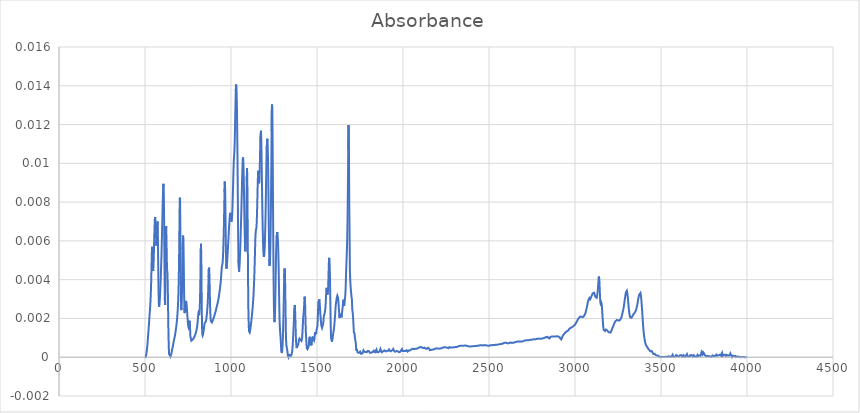
| Category | Absorbance |
|---|---|
| 3997.70514 | 0 |
| 3995.77668 | 0 |
| 3993.84822 | 0 |
| 3991.91975 | 0 |
| 3989.99129 | 0 |
| 3988.06283 | 0 |
| 3986.13436 | 0 |
| 3984.2059 | 0 |
| 3982.27743 | 0 |
| 3980.34897 | 0 |
| 3978.42051 | 0 |
| 3976.49204 | 0 |
| 3974.56358 | 0 |
| 3972.63512 | 0 |
| 3970.70665 | 0 |
| 3968.77819 | 0 |
| 3966.84973 | 0 |
| 3964.92126 | 0 |
| 3962.9928 | 0 |
| 3961.06433 | 0 |
| 3959.13587 | 0 |
| 3957.20741 | 0 |
| 3955.27894 | 0 |
| 3953.35048 | 0 |
| 3951.42202 | 0 |
| 3949.49355 | 0 |
| 3947.56509 | 0 |
| 3945.63663 | 0 |
| 3943.70816 | 0 |
| 3941.7797 | 0 |
| 3939.85123 | 0 |
| 3937.92277 | 0 |
| 3935.99431 | 0 |
| 3934.06584 | 0 |
| 3932.13738 | 0 |
| 3930.20892 | 0 |
| 3928.28045 | 0 |
| 3926.35199 | 0 |
| 3924.42353 | 0 |
| 3922.49506 | 0 |
| 3920.5666 | 0 |
| 3918.63813 | 0 |
| 3916.70967 | 0 |
| 3914.78121 | 0 |
| 3912.85274 | 0 |
| 3910.92428 | 0 |
| 3908.99582 | 0 |
| 3907.06735 | 0 |
| 3905.13889 | 0 |
| 3903.21043 | 0 |
| 3901.28196 | 0 |
| 3899.3535 | 0 |
| 3897.42503 | 0 |
| 3895.49657 | 0 |
| 3893.56811 | 0 |
| 3891.63964 | 0 |
| 3889.71118 | 0 |
| 3887.78272 | 0 |
| 3885.85425 | 0 |
| 3883.92579 | 0 |
| 3881.99733 | 0 |
| 3880.06886 | 0 |
| 3878.1404 | 0 |
| 3876.21193 | 0 |
| 3874.28347 | 0 |
| 3872.35501 | 0 |
| 3870.42654 | 0 |
| 3868.49808 | 0 |
| 3866.56962 | 0 |
| 3864.64115 | 0 |
| 3862.71269 | 0 |
| 3860.78422 | 0 |
| 3858.85576 | 0 |
| 3856.9273 | 0 |
| 3854.99883 | 0 |
| 3853.07037 | 0 |
| 3851.14191 | 0 |
| 3849.21344 | 0 |
| 3847.28498 | 0 |
| 3845.35652 | 0 |
| 3843.42805 | 0 |
| 3841.49959 | 0 |
| 3839.57112 | 0 |
| 3837.64266 | 0 |
| 3835.7142 | 0 |
| 3833.78573 | 0 |
| 3831.85727 | 0 |
| 3829.92881 | 0 |
| 3828.00034 | 0 |
| 3826.07188 | 0 |
| 3824.14342 | 0 |
| 3822.21495 | 0 |
| 3820.28649 | 0 |
| 3818.35802 | 0 |
| 3816.42956 | 0 |
| 3814.5011 | 0 |
| 3812.57263 | 0 |
| 3810.64417 | 0 |
| 3808.71571 | 0 |
| 3806.78724 | 0 |
| 3804.85878 | 0 |
| 3802.93032 | 0 |
| 3801.00185 | 0 |
| 3799.07339 | 0 |
| 3797.14492 | 0 |
| 3795.21646 | 0 |
| 3793.288 | 0 |
| 3791.35953 | 0 |
| 3789.43107 | 0 |
| 3787.50261 | 0 |
| 3785.57414 | 0 |
| 3783.64568 | 0 |
| 3781.71722 | 0 |
| 3779.78875 | 0 |
| 3777.86029 | 0 |
| 3775.93182 | 0 |
| 3774.00336 | 0 |
| 3772.0749 | 0 |
| 3770.14643 | 0 |
| 3768.21797 | 0 |
| 3766.28951 | 0 |
| 3764.36104 | 0 |
| 3762.43258 | 0 |
| 3760.50412 | 0 |
| 3758.57565 | 0 |
| 3756.64719 | 0 |
| 3754.71872 | 0 |
| 3752.79026 | 0 |
| 3750.8618 | 0 |
| 3748.93333 | 0 |
| 3747.00487 | 0 |
| 3745.07641 | 0 |
| 3743.14794 | 0 |
| 3741.21948 | 0 |
| 3739.29102 | 0 |
| 3737.36255 | 0 |
| 3735.43409 | 0 |
| 3733.50562 | 0 |
| 3731.57716 | 0 |
| 3729.6487 | 0 |
| 3727.72023 | 0 |
| 3725.79177 | 0 |
| 3723.86331 | 0 |
| 3721.93484 | 0 |
| 3720.00638 | 0 |
| 3718.07791 | 0 |
| 3716.14945 | 0 |
| 3714.22099 | 0 |
| 3712.29252 | 0 |
| 3710.36406 | 0 |
| 3708.4356 | 0 |
| 3706.50713 | 0 |
| 3704.57867 | 0 |
| 3702.65021 | 0 |
| 3700.72174 | 0 |
| 3698.79328 | 0 |
| 3696.86481 | 0 |
| 3694.93635 | 0 |
| 3693.00789 | 0 |
| 3691.07942 | 0 |
| 3689.15096 | 0 |
| 3687.2225 | 0 |
| 3685.29403 | 0 |
| 3683.36557 | 0 |
| 3681.43711 | 0 |
| 3679.50864 | 0 |
| 3677.58018 | 0 |
| 3675.65171 | 0 |
| 3673.72325 | 0 |
| 3671.79479 | 0 |
| 3669.86632 | 0 |
| 3667.93786 | 0 |
| 3666.0094 | 0 |
| 3664.08093 | 0 |
| 3662.15247 | 0 |
| 3660.22401 | 0 |
| 3658.29554 | 0 |
| 3656.36708 | 0 |
| 3654.43861 | 0 |
| 3652.51015 | 0 |
| 3650.58169 | 0 |
| 3648.65322 | 0 |
| 3646.72476 | 0 |
| 3644.7963 | 0 |
| 3642.86783 | 0 |
| 3640.93937 | 0 |
| 3639.01091 | 0 |
| 3637.08244 | 0 |
| 3635.15398 | 0 |
| 3633.22551 | 0 |
| 3631.29705 | 0 |
| 3629.36859 | 0 |
| 3627.44012 | 0 |
| 3625.51166 | 0 |
| 3623.5832 | 0 |
| 3621.65473 | 0 |
| 3619.72627 | 0 |
| 3617.79781 | 0 |
| 3615.86934 | 0 |
| 3613.94088 | 0 |
| 3612.01241 | 0 |
| 3610.08395 | 0 |
| 3608.15549 | 0 |
| 3606.22702 | 0 |
| 3604.29856 | 0 |
| 3602.3701 | 0 |
| 3600.44163 | 0 |
| 3598.51317 | 0 |
| 3596.58471 | 0 |
| 3594.65624 | 0 |
| 3592.72778 | 0 |
| 3590.79931 | 0 |
| 3588.87085 | 0 |
| 3586.94239 | 0 |
| 3585.01392 | 0 |
| 3583.08546 | 0 |
| 3581.157 | 0 |
| 3579.22853 | 0 |
| 3577.30007 | 0 |
| 3575.3716 | 0 |
| 3573.44314 | 0 |
| 3571.51468 | 0 |
| 3569.58621 | 0 |
| 3567.65775 | 0 |
| 3565.72929 | 0 |
| 3563.80082 | 0 |
| 3561.87236 | 0 |
| 3559.9439 | 0 |
| 3558.01543 | 0 |
| 3556.08697 | 0 |
| 3554.1585 | 0 |
| 3552.23004 | 0 |
| 3550.30158 | 0 |
| 3548.37311 | 0 |
| 3546.44465 | 0 |
| 3544.51619 | 0 |
| 3542.58772 | 0 |
| 3540.65926 | 0 |
| 3538.7308 | 0 |
| 3536.80233 | 0 |
| 3534.87387 | 0 |
| 3532.9454 | 0 |
| 3531.01694 | 0 |
| 3529.08848 | 0 |
| 3527.16001 | 0 |
| 3525.23155 | 0 |
| 3523.30309 | 0 |
| 3521.37462 | 0 |
| 3519.44616 | 0 |
| 3517.5177 | 0 |
| 3515.58923 | 0 |
| 3513.66077 | 0 |
| 3511.7323 | 0 |
| 3509.80384 | 0 |
| 3507.87538 | 0 |
| 3505.94691 | 0 |
| 3504.01845 | 0 |
| 3502.08999 | 0 |
| 3500.16152 | 0 |
| 3498.23306 | 0 |
| 3496.3046 | 0 |
| 3494.37613 | 0 |
| 3492.44767 | 0 |
| 3490.5192 | 0 |
| 3488.59074 | 0 |
| 3486.66228 | 0 |
| 3484.73381 | 0 |
| 3482.80535 | 0 |
| 3480.87689 | 0 |
| 3478.94842 | 0 |
| 3477.01996 | 0 |
| 3475.0915 | 0 |
| 3473.16303 | 0 |
| 3471.23457 | 0 |
| 3469.3061 | 0 |
| 3467.37764 | 0 |
| 3465.44918 | 0 |
| 3463.52071 | 0 |
| 3461.59225 | 0 |
| 3459.66379 | 0 |
| 3457.73532 | 0 |
| 3455.80686 | 0 |
| 3453.8784 | 0 |
| 3451.94993 | 0 |
| 3450.02147 | 0 |
| 3448.093 | 0 |
| 3446.16454 | 0 |
| 3444.23608 | 0 |
| 3442.30761 | 0 |
| 3440.37915 | 0 |
| 3438.45069 | 0 |
| 3436.52222 | 0 |
| 3434.59376 | 0 |
| 3432.66529 | 0 |
| 3430.73683 | 0 |
| 3428.80837 | 0 |
| 3426.8799 | 0 |
| 3424.95144 | 0 |
| 3423.02298 | 0 |
| 3421.09451 | 0.001 |
| 3419.16605 | 0.001 |
| 3417.23759 | 0.001 |
| 3415.30912 | 0.001 |
| 3413.38066 | 0.001 |
| 3411.45219 | 0.001 |
| 3409.52373 | 0.001 |
| 3407.59527 | 0.001 |
| 3405.6668 | 0.001 |
| 3403.73834 | 0.001 |
| 3401.80988 | 0.001 |
| 3399.88141 | 0.001 |
| 3397.95295 | 0.001 |
| 3396.02449 | 0.002 |
| 3394.09602 | 0.002 |
| 3392.16756 | 0.002 |
| 3390.23909 | 0.002 |
| 3388.31063 | 0.003 |
| 3386.38217 | 0.003 |
| 3384.4537 | 0.003 |
| 3382.52524 | 0.003 |
| 3380.59678 | 0.003 |
| 3378.66831 | 0.003 |
| 3376.73985 | 0.003 |
| 3374.81139 | 0.003 |
| 3372.88292 | 0.003 |
| 3370.95446 | 0.003 |
| 3369.02599 | 0.003 |
| 3367.09753 | 0.003 |
| 3365.16907 | 0.003 |
| 3363.2406 | 0.003 |
| 3361.31214 | 0.003 |
| 3359.38368 | 0.003 |
| 3357.45521 | 0.003 |
| 3355.52675 | 0.002 |
| 3353.59829 | 0.002 |
| 3351.66982 | 0.002 |
| 3349.74136 | 0.002 |
| 3347.81289 | 0.002 |
| 3345.88443 | 0.002 |
| 3343.95597 | 0.002 |
| 3342.0275 | 0.002 |
| 3340.09904 | 0.002 |
| 3338.17058 | 0.002 |
| 3336.24211 | 0.002 |
| 3334.31365 | 0.002 |
| 3332.38519 | 0.002 |
| 3330.45672 | 0.002 |
| 3328.52826 | 0.002 |
| 3326.59979 | 0.002 |
| 3324.67133 | 0.002 |
| 3322.74287 | 0.002 |
| 3320.8144 | 0.002 |
| 3318.88594 | 0.002 |
| 3316.95748 | 0.002 |
| 3315.02901 | 0.002 |
| 3313.10055 | 0.002 |
| 3311.17208 | 0.003 |
| 3309.24362 | 0.003 |
| 3307.31516 | 0.003 |
| 3305.38669 | 0.003 |
| 3303.45823 | 0.003 |
| 3301.52977 | 0.003 |
| 3299.6013 | 0.003 |
| 3297.67284 | 0.003 |
| 3295.74438 | 0.003 |
| 3293.81591 | 0.003 |
| 3291.88745 | 0.003 |
| 3289.95898 | 0.003 |
| 3288.03052 | 0.003 |
| 3286.10206 | 0.003 |
| 3284.17359 | 0.003 |
| 3282.24513 | 0.003 |
| 3280.31667 | 0.002 |
| 3278.3882 | 0.002 |
| 3276.45974 | 0.002 |
| 3274.53128 | 0.002 |
| 3272.60281 | 0.002 |
| 3270.67435 | 0.002 |
| 3268.74588 | 0.002 |
| 3266.81742 | 0.002 |
| 3264.88896 | 0.002 |
| 3262.96049 | 0.002 |
| 3261.03203 | 0.002 |
| 3259.10357 | 0.002 |
| 3257.1751 | 0.002 |
| 3255.24664 | 0.002 |
| 3253.31818 | 0.002 |
| 3251.38971 | 0.002 |
| 3249.46125 | 0.002 |
| 3247.53278 | 0.002 |
| 3245.60432 | 0.002 |
| 3243.67586 | 0.002 |
| 3241.74739 | 0.002 |
| 3239.81893 | 0.002 |
| 3237.89047 | 0.002 |
| 3235.962 | 0.002 |
| 3234.03354 | 0.002 |
| 3232.10508 | 0.002 |
| 3230.17661 | 0.002 |
| 3228.24815 | 0.002 |
| 3226.31968 | 0.002 |
| 3224.39122 | 0.002 |
| 3222.46276 | 0.002 |
| 3220.53429 | 0.002 |
| 3218.60583 | 0.002 |
| 3216.67737 | 0.001 |
| 3214.7489 | 0.001 |
| 3212.82044 | 0.001 |
| 3210.89198 | 0.001 |
| 3208.96351 | 0.001 |
| 3207.03505 | 0.001 |
| 3205.10658 | 0.001 |
| 3203.17812 | 0.001 |
| 3201.24966 | 0.001 |
| 3199.32119 | 0.001 |
| 3197.39273 | 0.001 |
| 3195.46427 | 0.001 |
| 3193.5358 | 0.001 |
| 3191.60734 | 0.001 |
| 3189.67888 | 0.001 |
| 3187.75041 | 0.001 |
| 3185.82195 | 0.001 |
| 3183.89348 | 0.001 |
| 3181.96502 | 0.001 |
| 3180.03656 | 0.001 |
| 3178.10809 | 0.001 |
| 3176.17963 | 0.001 |
| 3174.25117 | 0.001 |
| 3172.3227 | 0.001 |
| 3170.39424 | 0.001 |
| 3168.46577 | 0.001 |
| 3166.53731 | 0.001 |
| 3164.60885 | 0.002 |
| 3162.68038 | 0.002 |
| 3160.75192 | 0.002 |
| 3158.82346 | 0.002 |
| 3156.89499 | 0.003 |
| 3154.96653 | 0.003 |
| 3153.03807 | 0.003 |
| 3151.1096 | 0.003 |
| 3149.18114 | 0.003 |
| 3147.25267 | 0.003 |
| 3145.32421 | 0.003 |
| 3143.39575 | 0.004 |
| 3141.46728 | 0.004 |
| 3139.53882 | 0.004 |
| 3137.61036 | 0.004 |
| 3135.68189 | 0.004 |
| 3133.75343 | 0.004 |
| 3131.82497 | 0.003 |
| 3129.8965 | 0.003 |
| 3127.96804 | 0.003 |
| 3126.03957 | 0.003 |
| 3124.11111 | 0.003 |
| 3122.18265 | 0.003 |
| 3120.25418 | 0.003 |
| 3118.32572 | 0.003 |
| 3116.39726 | 0.003 |
| 3114.46879 | 0.003 |
| 3112.54033 | 0.003 |
| 3110.61187 | 0.003 |
| 3108.6834 | 0.003 |
| 3106.75494 | 0.003 |
| 3104.82647 | 0.003 |
| 3102.89801 | 0.003 |
| 3100.96955 | 0.003 |
| 3099.04108 | 0.003 |
| 3097.11262 | 0.003 |
| 3095.18416 | 0.003 |
| 3093.25569 | 0.003 |
| 3091.32723 | 0.003 |
| 3089.39877 | 0.003 |
| 3087.4703 | 0.003 |
| 3085.54184 | 0.003 |
| 3083.61337 | 0.003 |
| 3081.68491 | 0.003 |
| 3079.75645 | 0.003 |
| 3077.82798 | 0.003 |
| 3075.89952 | 0.003 |
| 3073.97106 | 0.003 |
| 3072.04259 | 0.003 |
| 3070.11413 | 0.003 |
| 3068.18567 | 0.003 |
| 3066.2572 | 0.002 |
| 3064.32874 | 0.002 |
| 3062.40027 | 0.002 |
| 3060.47181 | 0.002 |
| 3058.54335 | 0.002 |
| 3056.61488 | 0.002 |
| 3054.68642 | 0.002 |
| 3052.75796 | 0.002 |
| 3050.82949 | 0.002 |
| 3048.90103 | 0.002 |
| 3046.97257 | 0.002 |
| 3045.0441 | 0.002 |
| 3043.11564 | 0.002 |
| 3041.18717 | 0.002 |
| 3039.25871 | 0.002 |
| 3037.33025 | 0.002 |
| 3035.40178 | 0.002 |
| 3033.47332 | 0.002 |
| 3031.54486 | 0.002 |
| 3029.61639 | 0.002 |
| 3027.68793 | 0.002 |
| 3025.75946 | 0.002 |
| 3023.831 | 0.002 |
| 3021.90254 | 0.002 |
| 3019.97407 | 0.002 |
| 3018.04561 | 0.002 |
| 3016.11715 | 0.002 |
| 3014.18868 | 0.002 |
| 3012.26022 | 0.002 |
| 3010.33176 | 0.002 |
| 3008.40329 | 0.002 |
| 3006.47483 | 0.002 |
| 3004.54636 | 0.002 |
| 3002.6179 | 0.002 |
| 3000.68944 | 0.002 |
| 2998.76097 | 0.002 |
| 2996.83251 | 0.002 |
| 2994.90405 | 0.002 |
| 2992.97558 | 0.002 |
| 2991.04712 | 0.002 |
| 2989.11866 | 0.002 |
| 2987.19019 | 0.002 |
| 2985.26173 | 0.002 |
| 2983.33326 | 0.002 |
| 2981.4048 | 0.002 |
| 2979.47634 | 0.002 |
| 2977.54787 | 0.002 |
| 2975.61941 | 0.002 |
| 2973.69095 | 0.002 |
| 2971.76248 | 0.002 |
| 2969.83402 | 0.001 |
| 2967.90556 | 0.001 |
| 2965.97709 | 0.001 |
| 2964.04863 | 0.001 |
| 2962.12016 | 0.001 |
| 2960.1917 | 0.001 |
| 2958.26324 | 0.001 |
| 2956.33477 | 0.001 |
| 2954.40631 | 0.001 |
| 2952.47785 | 0.001 |
| 2950.54938 | 0.001 |
| 2948.62092 | 0.001 |
| 2946.69246 | 0.001 |
| 2944.76399 | 0.001 |
| 2942.83553 | 0.001 |
| 2940.90706 | 0.001 |
| 2938.9786 | 0.001 |
| 2937.05014 | 0.001 |
| 2935.12167 | 0.001 |
| 2933.19321 | 0.001 |
| 2931.26475 | 0.001 |
| 2929.33628 | 0.001 |
| 2927.40782 | 0.001 |
| 2925.47936 | 0.001 |
| 2923.55089 | 0.001 |
| 2921.62243 | 0.001 |
| 2919.69396 | 0.001 |
| 2917.7655 | 0.001 |
| 2915.83704 | 0.001 |
| 2913.90857 | 0.001 |
| 2911.98011 | 0.001 |
| 2910.05165 | 0.001 |
| 2908.12318 | 0.001 |
| 2906.19472 | 0.001 |
| 2904.26626 | 0.001 |
| 2902.33779 | 0.001 |
| 2900.40933 | 0.001 |
| 2898.48086 | 0.001 |
| 2896.5524 | 0.001 |
| 2894.62394 | 0.001 |
| 2892.69547 | 0.001 |
| 2890.76701 | 0.001 |
| 2888.83855 | 0.001 |
| 2886.91008 | 0.001 |
| 2884.98162 | 0.001 |
| 2883.05315 | 0.001 |
| 2881.12469 | 0.001 |
| 2879.19623 | 0.001 |
| 2877.26776 | 0.001 |
| 2875.3393 | 0.001 |
| 2873.41084 | 0.001 |
| 2871.48237 | 0.001 |
| 2869.55391 | 0.001 |
| 2867.62545 | 0.001 |
| 2865.69698 | 0.001 |
| 2863.76852 | 0.001 |
| 2861.84005 | 0.001 |
| 2859.91159 | 0.001 |
| 2857.98313 | 0.001 |
| 2856.05466 | 0.001 |
| 2854.1262 | 0.001 |
| 2852.19774 | 0.001 |
| 2850.26927 | 0.001 |
| 2848.34081 | 0.001 |
| 2846.41235 | 0.001 |
| 2844.48388 | 0.001 |
| 2842.55542 | 0.001 |
| 2840.62695 | 0.001 |
| 2838.69849 | 0.001 |
| 2836.77003 | 0.001 |
| 2834.84156 | 0.001 |
| 2832.9131 | 0.001 |
| 2830.98464 | 0.001 |
| 2829.05617 | 0.001 |
| 2827.12771 | 0.001 |
| 2825.19925 | 0.001 |
| 2823.27078 | 0.001 |
| 2821.34232 | 0.001 |
| 2819.41385 | 0.001 |
| 2817.48539 | 0.001 |
| 2815.55693 | 0.001 |
| 2813.62846 | 0.001 |
| 2811.7 | 0.001 |
| 2809.77154 | 0.001 |
| 2807.84307 | 0.001 |
| 2805.91461 | 0.001 |
| 2803.98615 | 0.001 |
| 2802.05768 | 0.001 |
| 2800.12922 | 0.001 |
| 2798.20075 | 0.001 |
| 2796.27229 | 0.001 |
| 2794.34383 | 0.001 |
| 2792.41536 | 0.001 |
| 2790.4869 | 0.001 |
| 2788.55844 | 0.001 |
| 2786.62997 | 0.001 |
| 2784.70151 | 0.001 |
| 2782.77305 | 0.001 |
| 2780.84458 | 0.001 |
| 2778.91612 | 0.001 |
| 2776.98765 | 0.001 |
| 2775.05919 | 0.001 |
| 2773.13073 | 0.001 |
| 2771.20226 | 0.001 |
| 2769.2738 | 0.001 |
| 2767.34534 | 0.001 |
| 2765.41687 | 0.001 |
| 2763.48841 | 0.001 |
| 2761.55995 | 0.001 |
| 2759.63148 | 0.001 |
| 2757.70302 | 0.001 |
| 2755.77455 | 0.001 |
| 2753.84609 | 0.001 |
| 2751.91763 | 0.001 |
| 2749.98916 | 0.001 |
| 2748.0607 | 0.001 |
| 2746.13224 | 0.001 |
| 2744.20377 | 0.001 |
| 2742.27531 | 0.001 |
| 2740.34684 | 0.001 |
| 2738.41838 | 0.001 |
| 2736.48992 | 0.001 |
| 2734.56145 | 0.001 |
| 2732.63299 | 0.001 |
| 2730.70453 | 0.001 |
| 2728.77606 | 0.001 |
| 2726.8476 | 0.001 |
| 2724.91914 | 0.001 |
| 2722.99067 | 0.001 |
| 2721.06221 | 0.001 |
| 2719.13374 | 0.001 |
| 2717.20528 | 0.001 |
| 2715.27682 | 0.001 |
| 2713.34835 | 0.001 |
| 2711.41989 | 0.001 |
| 2709.49143 | 0.001 |
| 2707.56296 | 0.001 |
| 2705.6345 | 0.001 |
| 2703.70604 | 0.001 |
| 2701.77757 | 0.001 |
| 2699.84911 | 0.001 |
| 2697.92064 | 0.001 |
| 2695.99218 | 0.001 |
| 2694.06372 | 0.001 |
| 2692.13525 | 0.001 |
| 2690.20679 | 0.001 |
| 2688.27833 | 0.001 |
| 2686.34986 | 0.001 |
| 2684.4214 | 0.001 |
| 2682.49294 | 0.001 |
| 2680.56447 | 0.001 |
| 2678.63601 | 0.001 |
| 2676.70754 | 0.001 |
| 2674.77908 | 0.001 |
| 2672.85062 | 0.001 |
| 2670.92215 | 0.001 |
| 2668.99369 | 0.001 |
| 2667.06523 | 0.001 |
| 2665.13676 | 0.001 |
| 2663.2083 | 0.001 |
| 2661.27984 | 0.001 |
| 2659.35137 | 0.001 |
| 2657.42291 | 0.001 |
| 2655.49444 | 0.001 |
| 2653.56598 | 0.001 |
| 2651.63752 | 0.001 |
| 2649.70905 | 0.001 |
| 2647.78059 | 0.001 |
| 2645.85213 | 0.001 |
| 2643.92366 | 0.001 |
| 2641.9952 | 0.001 |
| 2640.06674 | 0.001 |
| 2638.13827 | 0.001 |
| 2636.20981 | 0.001 |
| 2634.28134 | 0.001 |
| 2632.35288 | 0.001 |
| 2630.42442 | 0.001 |
| 2628.49595 | 0.001 |
| 2626.56749 | 0.001 |
| 2624.63903 | 0.001 |
| 2622.71056 | 0.001 |
| 2620.7821 | 0.001 |
| 2618.85364 | 0.001 |
| 2616.92517 | 0.001 |
| 2614.99671 | 0.001 |
| 2613.06824 | 0.001 |
| 2611.13978 | 0.001 |
| 2609.21132 | 0.001 |
| 2607.28285 | 0.001 |
| 2605.35439 | 0.001 |
| 2603.42593 | 0.001 |
| 2601.49746 | 0.001 |
| 2599.569 | 0.001 |
| 2597.64053 | 0.001 |
| 2595.71207 | 0.001 |
| 2593.78361 | 0.001 |
| 2591.85514 | 0.001 |
| 2589.92668 | 0.001 |
| 2587.99822 | 0.001 |
| 2586.06975 | 0.001 |
| 2584.14129 | 0.001 |
| 2582.21283 | 0.001 |
| 2580.28436 | 0.001 |
| 2578.3559 | 0.001 |
| 2576.42743 | 0.001 |
| 2574.49897 | 0.001 |
| 2572.57051 | 0.001 |
| 2570.64204 | 0.001 |
| 2568.71358 | 0.001 |
| 2566.78512 | 0.001 |
| 2564.85665 | 0.001 |
| 2562.92819 | 0.001 |
| 2560.99973 | 0.001 |
| 2559.07126 | 0.001 |
| 2557.1428 | 0.001 |
| 2555.21433 | 0.001 |
| 2553.28587 | 0.001 |
| 2551.35741 | 0.001 |
| 2549.42894 | 0.001 |
| 2547.50048 | 0.001 |
| 2545.57202 | 0.001 |
| 2543.64355 | 0.001 |
| 2541.71509 | 0.001 |
| 2539.78663 | 0.001 |
| 2537.85816 | 0.001 |
| 2535.9297 | 0.001 |
| 2534.00123 | 0.001 |
| 2532.07277 | 0.001 |
| 2530.14431 | 0.001 |
| 2528.21584 | 0.001 |
| 2526.28738 | 0.001 |
| 2524.35892 | 0.001 |
| 2522.43045 | 0.001 |
| 2520.50199 | 0.001 |
| 2518.57353 | 0.001 |
| 2516.64506 | 0.001 |
| 2514.7166 | 0.001 |
| 2512.78813 | 0.001 |
| 2510.85967 | 0.001 |
| 2508.93121 | 0.001 |
| 2507.00274 | 0.001 |
| 2505.07428 | 0.001 |
| 2503.14582 | 0.001 |
| 2501.21735 | 0.001 |
| 2499.28889 | 0.001 |
| 2497.36043 | 0.001 |
| 2495.43196 | 0.001 |
| 2493.5035 | 0.001 |
| 2491.57503 | 0.001 |
| 2489.64657 | 0.001 |
| 2487.71811 | 0.001 |
| 2485.78964 | 0.001 |
| 2483.86118 | 0.001 |
| 2481.93272 | 0.001 |
| 2480.00425 | 0.001 |
| 2478.07579 | 0.001 |
| 2476.14733 | 0.001 |
| 2474.21886 | 0.001 |
| 2472.2904 | 0.001 |
| 2470.36193 | 0.001 |
| 2468.43347 | 0.001 |
| 2466.50501 | 0.001 |
| 2464.57654 | 0.001 |
| 2462.64808 | 0.001 |
| 2460.71962 | 0.001 |
| 2458.79115 | 0.001 |
| 2456.86269 | 0.001 |
| 2454.93422 | 0.001 |
| 2453.00576 | 0.001 |
| 2451.0773 | 0.001 |
| 2449.14883 | 0.001 |
| 2447.22037 | 0.001 |
| 2445.29191 | 0.001 |
| 2443.36344 | 0.001 |
| 2441.43498 | 0.001 |
| 2439.50652 | 0.001 |
| 2437.57805 | 0.001 |
| 2435.64959 | 0.001 |
| 2433.72112 | 0.001 |
| 2431.79266 | 0.001 |
| 2429.8642 | 0.001 |
| 2427.93573 | 0.001 |
| 2426.00727 | 0.001 |
| 2424.07881 | 0.001 |
| 2422.15034 | 0.001 |
| 2420.22188 | 0.001 |
| 2418.29342 | 0.001 |
| 2416.36495 | 0.001 |
| 2414.43649 | 0.001 |
| 2412.50802 | 0.001 |
| 2410.57956 | 0.001 |
| 2408.6511 | 0.001 |
| 2406.72263 | 0.001 |
| 2404.79417 | 0.001 |
| 2402.86571 | 0.001 |
| 2400.93724 | 0.001 |
| 2399.00878 | 0.001 |
| 2397.08032 | 0.001 |
| 2395.15185 | 0.001 |
| 2393.22339 | 0.001 |
| 2391.29492 | 0.001 |
| 2389.36646 | 0.001 |
| 2387.438 | 0.001 |
| 2385.50953 | 0.001 |
| 2383.58107 | 0.001 |
| 2381.65261 | 0.001 |
| 2379.72414 | 0.001 |
| 2377.79568 | 0.001 |
| 2375.86722 | 0.001 |
| 2373.93875 | 0.001 |
| 2372.01029 | 0.001 |
| 2370.08182 | 0.001 |
| 2368.15336 | 0.001 |
| 2366.2249 | 0.001 |
| 2364.29643 | 0.001 |
| 2362.36797 | 0.001 |
| 2360.43951 | 0.001 |
| 2358.51104 | 0.001 |
| 2356.58258 | 0.001 |
| 2354.65412 | 0.001 |
| 2352.72565 | 0.001 |
| 2350.79719 | 0.001 |
| 2348.86872 | 0.001 |
| 2346.94026 | 0.001 |
| 2345.0118 | 0.001 |
| 2343.08333 | 0.001 |
| 2341.15487 | 0.001 |
| 2339.22641 | 0.001 |
| 2337.29794 | 0.001 |
| 2335.36948 | 0.001 |
| 2333.44102 | 0.001 |
| 2331.51255 | 0.001 |
| 2329.58409 | 0.001 |
| 2327.65562 | 0.001 |
| 2325.72716 | 0.001 |
| 2323.7987 | 0.001 |
| 2321.87023 | 0.001 |
| 2319.94177 | 0.001 |
| 2318.01331 | 0.001 |
| 2316.08484 | 0.001 |
| 2314.15638 | 0.001 |
| 2312.22791 | 0.001 |
| 2310.29945 | 0.001 |
| 2308.37099 | 0.001 |
| 2306.44252 | 0.001 |
| 2304.51406 | 0.001 |
| 2302.5856 | 0.001 |
| 2300.65713 | 0.001 |
| 2298.72867 | 0.001 |
| 2296.80021 | 0.001 |
| 2294.87174 | 0.001 |
| 2292.94328 | 0.001 |
| 2291.01481 | 0.001 |
| 2289.08635 | 0.001 |
| 2287.15789 | 0.001 |
| 2285.22942 | 0 |
| 2283.30096 | 0 |
| 2281.3725 | 0 |
| 2279.44403 | 0 |
| 2277.51557 | 0 |
| 2275.58711 | 0 |
| 2273.65864 | 0.001 |
| 2271.73018 | 0.001 |
| 2269.80171 | 0.001 |
| 2267.87325 | 0.001 |
| 2265.94479 | 0 |
| 2264.01632 | 0 |
| 2262.08786 | 0 |
| 2260.1594 | 0 |
| 2258.23093 | 0 |
| 2256.30247 | 0 |
| 2254.37401 | 0.001 |
| 2252.44554 | 0.001 |
| 2250.51708 | 0.001 |
| 2248.58861 | 0.001 |
| 2246.66015 | 0.001 |
| 2244.73169 | 0.001 |
| 2242.80322 | 0.001 |
| 2240.87476 | 0.001 |
| 2238.9463 | 0.001 |
| 2237.01783 | 0.001 |
| 2235.08937 | 0.001 |
| 2233.16091 | 0.001 |
| 2231.23244 | 0 |
| 2229.30398 | 0 |
| 2227.37551 | 0 |
| 2225.44705 | 0 |
| 2223.51859 | 0 |
| 2221.59012 | 0 |
| 2219.66166 | 0 |
| 2217.7332 | 0 |
| 2215.80473 | 0 |
| 2213.87627 | 0 |
| 2211.94781 | 0 |
| 2210.01934 | 0 |
| 2208.09088 | 0 |
| 2206.16241 | 0 |
| 2204.23395 | 0 |
| 2202.30549 | 0 |
| 2200.37702 | 0 |
| 2198.44856 | 0 |
| 2196.5201 | 0 |
| 2194.59163 | 0 |
| 2192.66317 | 0 |
| 2190.73471 | 0 |
| 2188.80624 | 0 |
| 2186.87778 | 0 |
| 2184.94931 | 0 |
| 2183.02085 | 0 |
| 2181.09239 | 0 |
| 2179.16392 | 0 |
| 2177.23546 | 0 |
| 2175.307 | 0 |
| 2173.37853 | 0 |
| 2171.45007 | 0 |
| 2169.5216 | 0 |
| 2167.59314 | 0 |
| 2165.66468 | 0 |
| 2163.73621 | 0 |
| 2161.80775 | 0 |
| 2159.87929 | 0 |
| 2157.95082 | 0 |
| 2156.02236 | 0 |
| 2154.0939 | 0 |
| 2152.16543 | 0 |
| 2150.23697 | 0 |
| 2148.3085 | 0 |
| 2146.38004 | 0 |
| 2144.45158 | 0 |
| 2142.52311 | 0 |
| 2140.59465 | 0 |
| 2138.66619 | 0 |
| 2136.73772 | 0 |
| 2134.80926 | 0 |
| 2132.8808 | 0 |
| 2130.95233 | 0 |
| 2129.02387 | 0 |
| 2127.0954 | 0 |
| 2125.16694 | 0 |
| 2123.23848 | 0 |
| 2121.31001 | 0 |
| 2119.38155 | 0 |
| 2117.45309 | 0 |
| 2115.52462 | 0 |
| 2113.59616 | 0 |
| 2111.6677 | 0 |
| 2109.73923 | 0.001 |
| 2107.81077 | 0.001 |
| 2105.8823 | 0.001 |
| 2103.95384 | 0.001 |
| 2102.02538 | 0.001 |
| 2100.09691 | 0.001 |
| 2098.16845 | 0.001 |
| 2096.23999 | 0 |
| 2094.31152 | 0.001 |
| 2092.38306 | 0.001 |
| 2090.4546 | 0 |
| 2088.52613 | 0 |
| 2086.59767 | 0 |
| 2084.6692 | 0 |
| 2082.74074 | 0 |
| 2080.81228 | 0 |
| 2078.88381 | 0 |
| 2076.95535 | 0 |
| 2075.02689 | 0 |
| 2073.09842 | 0 |
| 2071.16996 | 0 |
| 2069.2415 | 0 |
| 2067.31303 | 0 |
| 2065.38457 | 0 |
| 2063.4561 | 0 |
| 2061.52764 | 0 |
| 2059.59918 | 0 |
| 2057.67071 | 0 |
| 2055.74225 | 0 |
| 2053.81379 | 0 |
| 2051.88532 | 0 |
| 2049.95686 | 0 |
| 2048.0284 | 0 |
| 2046.09993 | 0 |
| 2044.17147 | 0 |
| 2042.243 | 0 |
| 2040.31454 | 0 |
| 2038.38608 | 0 |
| 2036.45761 | 0 |
| 2034.52915 | 0 |
| 2032.60069 | 0 |
| 2030.67222 | 0 |
| 2028.74376 | 0 |
| 2026.81529 | 0 |
| 2024.88683 | 0 |
| 2022.95837 | 0 |
| 2021.0299 | 0 |
| 2019.10144 | 0 |
| 2017.17298 | 0 |
| 2015.24451 | 0 |
| 2013.31605 | 0 |
| 2011.38759 | 0 |
| 2009.45912 | 0 |
| 2007.53066 | 0 |
| 2005.60219 | 0 |
| 2003.67373 | 0 |
| 2001.74527 | 0 |
| 1999.8168 | 0 |
| 1997.88834 | 0 |
| 1995.95988 | 0 |
| 1994.03141 | 0 |
| 1992.10295 | 0 |
| 1990.17449 | 0 |
| 1988.24602 | 0 |
| 1986.31756 | 0 |
| 1984.38909 | 0 |
| 1982.46063 | 0 |
| 1980.53217 | 0 |
| 1978.6037 | 0 |
| 1976.67524 | 0 |
| 1974.74678 | 0 |
| 1972.81831 | 0 |
| 1970.88985 | 0 |
| 1968.96139 | 0 |
| 1967.03292 | 0 |
| 1965.10446 | 0 |
| 1963.17599 | 0 |
| 1961.24753 | 0 |
| 1959.31907 | 0 |
| 1957.3906 | 0 |
| 1955.46214 | 0 |
| 1953.53368 | 0 |
| 1951.60521 | 0 |
| 1949.67675 | 0 |
| 1947.74829 | 0 |
| 1945.81982 | 0 |
| 1943.89136 | 0 |
| 1941.96289 | 0 |
| 1940.03443 | 0 |
| 1938.10597 | 0 |
| 1936.1775 | 0 |
| 1934.24904 | 0 |
| 1932.32058 | 0 |
| 1930.39211 | 0 |
| 1928.46365 | 0 |
| 1926.53519 | 0 |
| 1924.60672 | 0 |
| 1922.67826 | 0 |
| 1920.74979 | 0 |
| 1918.82133 | 0 |
| 1916.89287 | 0 |
| 1914.9644 | 0 |
| 1913.03594 | 0 |
| 1911.10748 | 0 |
| 1909.17901 | 0 |
| 1907.25055 | 0 |
| 1905.32209 | 0 |
| 1903.39362 | 0 |
| 1901.46516 | 0 |
| 1899.53669 | 0 |
| 1897.60823 | 0 |
| 1895.67977 | 0 |
| 1893.7513 | 0 |
| 1891.82284 | 0 |
| 1889.89438 | 0 |
| 1887.96591 | 0 |
| 1886.03745 | 0 |
| 1884.10898 | 0 |
| 1882.18052 | 0 |
| 1880.25206 | 0 |
| 1878.32359 | 0 |
| 1876.39513 | 0 |
| 1874.46667 | 0 |
| 1872.5382 | 0 |
| 1870.60974 | 0 |
| 1868.68128 | 0 |
| 1866.75281 | 0 |
| 1864.82435 | 0 |
| 1862.89588 | 0 |
| 1860.96742 | 0 |
| 1859.03896 | 0 |
| 1857.11049 | 0 |
| 1855.18203 | 0 |
| 1853.25357 | 0 |
| 1851.3251 | 0 |
| 1849.39664 | 0 |
| 1847.46818 | 0 |
| 1845.53971 | 0 |
| 1843.61125 | 0 |
| 1841.68278 | 0 |
| 1839.75432 | 0 |
| 1837.82586 | 0 |
| 1835.89739 | 0 |
| 1833.96893 | 0 |
| 1832.04047 | 0 |
| 1830.112 | 0 |
| 1828.18354 | 0 |
| 1826.25508 | 0 |
| 1824.32661 | 0 |
| 1822.39815 | 0 |
| 1820.46968 | 0 |
| 1818.54122 | 0 |
| 1816.61276 | 0 |
| 1814.68429 | 0 |
| 1812.75583 | 0 |
| 1810.82737 | 0 |
| 1808.8989 | 0 |
| 1806.97044 | 0 |
| 1805.04198 | 0 |
| 1803.11351 | 0 |
| 1801.18505 | 0 |
| 1799.25658 | 0 |
| 1797.32812 | 0 |
| 1795.39966 | 0 |
| 1793.47119 | 0 |
| 1791.54273 | 0 |
| 1789.61427 | 0 |
| 1787.6858 | 0 |
| 1785.75734 | 0 |
| 1783.82888 | 0 |
| 1781.90041 | 0 |
| 1779.97195 | 0 |
| 1778.04348 | 0 |
| 1776.11502 | 0 |
| 1774.18656 | 0 |
| 1772.25809 | 0 |
| 1770.32963 | 0 |
| 1768.40117 | 0 |
| 1766.4727 | 0 |
| 1764.54424 | 0 |
| 1762.61578 | 0 |
| 1760.68731 | 0 |
| 1758.75885 | 0 |
| 1756.83038 | 0 |
| 1754.90192 | 0 |
| 1752.97346 | 0 |
| 1751.04499 | 0 |
| 1749.11653 | 0 |
| 1747.18807 | 0 |
| 1745.2596 | 0 |
| 1743.33114 | 0 |
| 1741.40267 | 0 |
| 1739.47421 | 0 |
| 1737.54575 | 0 |
| 1735.61728 | 0 |
| 1733.68882 | 0 |
| 1731.76036 | 0 |
| 1729.83189 | 0 |
| 1727.90343 | 0 |
| 1725.97497 | 0.001 |
| 1724.0465 | 0.001 |
| 1722.11804 | 0.001 |
| 1720.18957 | 0.001 |
| 1718.26111 | 0.001 |
| 1716.33265 | 0.001 |
| 1714.40418 | 0.001 |
| 1712.47572 | 0.002 |
| 1710.54726 | 0.002 |
| 1708.61879 | 0.002 |
| 1706.69033 | 0.002 |
| 1704.76187 | 0.002 |
| 1702.8334 | 0.003 |
| 1700.90494 | 0.003 |
| 1698.97647 | 0.003 |
| 1697.04801 | 0.003 |
| 1695.11955 | 0.004 |
| 1693.19108 | 0.004 |
| 1691.26262 | 0.005 |
| 1689.33416 | 0.004 |
| 1687.40569 | 0.008 |
| 1685.47723 | 0.011 |
| 1683.54877 | 0.012 |
| 1681.6203 | 0.011 |
| 1679.69184 | 0.009 |
| 1677.76337 | 0.007 |
| 1675.83491 | 0.006 |
| 1673.90645 | 0.006 |
| 1671.97798 | 0.005 |
| 1670.04952 | 0.005 |
| 1668.12106 | 0.004 |
| 1666.19259 | 0.003 |
| 1664.26413 | 0.003 |
| 1662.33567 | 0.003 |
| 1660.4072 | 0.003 |
| 1658.47874 | 0.003 |
| 1656.55027 | 0.003 |
| 1654.62181 | 0.003 |
| 1652.69335 | 0.003 |
| 1650.76488 | 0.003 |
| 1648.83642 | 0.003 |
| 1646.90796 | 0.002 |
| 1644.97949 | 0.002 |
| 1643.05103 | 0.002 |
| 1641.12257 | 0.002 |
| 1639.1941 | 0.002 |
| 1637.26564 | 0.002 |
| 1635.33717 | 0.002 |
| 1633.40871 | 0.002 |
| 1631.48025 | 0.002 |
| 1629.55178 | 0.002 |
| 1627.62332 | 0.002 |
| 1625.69486 | 0.003 |
| 1623.76639 | 0.003 |
| 1621.83793 | 0.003 |
| 1619.90946 | 0.003 |
| 1617.981 | 0.003 |
| 1616.05254 | 0.003 |
| 1614.12407 | 0.003 |
| 1612.19561 | 0.003 |
| 1610.26715 | 0.003 |
| 1608.33868 | 0.003 |
| 1606.41022 | 0.002 |
| 1604.48176 | 0.002 |
| 1602.55329 | 0.002 |
| 1600.62483 | 0.002 |
| 1598.69636 | 0.001 |
| 1596.7679 | 0.001 |
| 1594.83944 | 0.001 |
| 1592.91097 | 0.001 |
| 1590.98251 | 0.001 |
| 1589.05405 | 0.001 |
| 1587.12558 | 0.001 |
| 1585.19712 | 0.001 |
| 1583.26866 | 0.001 |
| 1581.34019 | 0.001 |
| 1579.41173 | 0.002 |
| 1577.48326 | 0.003 |
| 1575.5548 | 0.004 |
| 1573.62634 | 0.005 |
| 1571.69787 | 0.005 |
| 1569.76941 | 0.005 |
| 1567.84095 | 0.005 |
| 1565.91248 | 0.004 |
| 1563.98402 | 0.003 |
| 1562.05556 | 0.003 |
| 1560.12709 | 0.003 |
| 1558.19863 | 0.004 |
| 1556.27016 | 0.004 |
| 1554.3417 | 0.003 |
| 1552.41324 | 0.003 |
| 1550.48477 | 0.003 |
| 1548.55631 | 0.003 |
| 1546.62785 | 0.002 |
| 1544.69938 | 0.002 |
| 1542.77092 | 0.002 |
| 1540.84246 | 0.002 |
| 1538.91399 | 0.002 |
| 1536.98553 | 0.002 |
| 1535.05706 | 0.002 |
| 1533.1286 | 0.002 |
| 1531.20014 | 0.002 |
| 1529.27167 | 0.002 |
| 1527.34321 | 0.002 |
| 1525.41475 | 0.002 |
| 1523.48628 | 0.002 |
| 1521.55782 | 0.002 |
| 1519.62936 | 0.002 |
| 1517.70089 | 0.002 |
| 1515.77243 | 0.003 |
| 1513.84396 | 0.003 |
| 1511.9155 | 0.003 |
| 1509.98704 | 0.003 |
| 1508.05857 | 0.003 |
| 1506.13011 | 0.002 |
| 1504.20165 | 0.002 |
| 1502.27318 | 0.002 |
| 1500.34472 | 0.002 |
| 1498.41626 | 0.001 |
| 1496.48779 | 0.001 |
| 1494.55933 | 0.001 |
| 1492.63086 | 0.001 |
| 1490.7024 | 0.001 |
| 1488.77394 | 0.001 |
| 1486.84547 | 0.001 |
| 1484.91701 | 0.001 |
| 1482.98855 | 0.001 |
| 1481.06008 | 0.001 |
| 1479.13162 | 0.001 |
| 1477.20315 | 0.001 |
| 1475.27469 | 0.001 |
| 1473.34623 | 0.001 |
| 1471.41776 | 0.001 |
| 1469.4893 | 0.001 |
| 1467.56084 | 0.001 |
| 1465.63237 | 0.001 |
| 1463.70391 | 0.001 |
| 1461.77545 | 0.001 |
| 1459.84698 | 0.001 |
| 1457.91852 | 0.001 |
| 1455.99005 | 0.001 |
| 1454.06159 | 0.001 |
| 1452.13313 | 0.001 |
| 1450.20466 | 0.001 |
| 1448.2762 | 0.001 |
| 1446.34774 | 0 |
| 1444.41927 | 0 |
| 1442.49081 | 0 |
| 1440.56235 | 0 |
| 1438.63388 | 0.001 |
| 1436.70542 | 0.001 |
| 1434.77695 | 0.001 |
| 1432.84849 | 0.002 |
| 1430.92003 | 0.003 |
| 1428.99156 | 0.003 |
| 1427.0631 | 0.003 |
| 1425.13464 | 0.003 |
| 1423.20617 | 0.002 |
| 1421.27771 | 0.002 |
| 1419.34925 | 0.002 |
| 1417.42078 | 0.002 |
| 1415.49232 | 0.001 |
| 1413.56385 | 0.001 |
| 1411.63539 | 0.001 |
| 1409.70693 | 0.001 |
| 1407.77846 | 0.001 |
| 1405.85 | 0.001 |
| 1403.92154 | 0.001 |
| 1401.99307 | 0.001 |
| 1400.06461 | 0.001 |
| 1398.13615 | 0.001 |
| 1396.20768 | 0.001 |
| 1394.27922 | 0.001 |
| 1392.35075 | 0.001 |
| 1390.42229 | 0.001 |
| 1388.49383 | 0.001 |
| 1386.56536 | 0.001 |
| 1384.6369 | 0.001 |
| 1382.70844 | 0 |
| 1380.77997 | 0.001 |
| 1378.85151 | 0.001 |
| 1376.92305 | 0.001 |
| 1374.99458 | 0.002 |
| 1373.06612 | 0.002 |
| 1371.13765 | 0.003 |
| 1369.20919 | 0.003 |
| 1367.28073 | 0.002 |
| 1365.35226 | 0.002 |
| 1363.4238 | 0.001 |
| 1361.49534 | 0.001 |
| 1359.56687 | 0.001 |
| 1357.63841 | 0 |
| 1355.70995 | 0 |
| 1353.78148 | 0 |
| 1351.85302 | 0 |
| 1349.92455 | 0 |
| 1347.99609 | 0 |
| 1346.06763 | 0 |
| 1344.13916 | 0 |
| 1342.2107 | 0 |
| 1340.28224 | 0 |
| 1338.35377 | 0 |
| 1336.42531 | 0 |
| 1334.49684 | 0 |
| 1332.56838 | 0 |
| 1330.63992 | 0 |
| 1328.71145 | 0 |
| 1326.78299 | 0 |
| 1324.85453 | 0 |
| 1322.92606 | 0 |
| 1320.9976 | 0.001 |
| 1319.06914 | 0.001 |
| 1317.14067 | 0.002 |
| 1315.21221 | 0.004 |
| 1313.28374 | 0.004 |
| 1311.35528 | 0.005 |
| 1309.42682 | 0.004 |
| 1307.49835 | 0.003 |
| 1305.56989 | 0.002 |
| 1303.64143 | 0.002 |
| 1301.71296 | 0.001 |
| 1299.7845 | 0.001 |
| 1297.85604 | 0 |
| 1295.92757 | 0 |
| 1293.99911 | 0 |
| 1292.07064 | 0 |
| 1290.14218 | 0.001 |
| 1288.21372 | 0.001 |
| 1286.28525 | 0.001 |
| 1284.35679 | 0.001 |
| 1282.42833 | 0.002 |
| 1280.49986 | 0.003 |
| 1278.5714 | 0.004 |
| 1276.64294 | 0.005 |
| 1274.71447 | 0.006 |
| 1272.78601 | 0.006 |
| 1270.85754 | 0.006 |
| 1268.92908 | 0.006 |
| 1267.00062 | 0.006 |
| 1265.07215 | 0.006 |
| 1263.14369 | 0.006 |
| 1261.21523 | 0.005 |
| 1259.28676 | 0.004 |
| 1257.3583 | 0.003 |
| 1255.42984 | 0.002 |
| 1253.50137 | 0.002 |
| 1251.57291 | 0.002 |
| 1249.64444 | 0.003 |
| 1247.71598 | 0.004 |
| 1245.78752 | 0.006 |
| 1243.85905 | 0.009 |
| 1241.93059 | 0.011 |
| 1240.00213 | 0.013 |
| 1238.07366 | 0.013 |
| 1236.1452 | 0.012 |
| 1234.21674 | 0.01 |
| 1232.28827 | 0.008 |
| 1230.35981 | 0.007 |
| 1228.43134 | 0.005 |
| 1226.50288 | 0.005 |
| 1224.57442 | 0.005 |
| 1222.64595 | 0.005 |
| 1220.71749 | 0.006 |
| 1218.78903 | 0.007 |
| 1216.86056 | 0.009 |
| 1214.9321 | 0.01 |
| 1213.00364 | 0.011 |
| 1211.07517 | 0.011 |
| 1209.14671 | 0.011 |
| 1207.21824 | 0.011 |
| 1205.28978 | 0.01 |
| 1203.36132 | 0.009 |
| 1201.43285 | 0.008 |
| 1199.50439 | 0.007 |
| 1197.57593 | 0.006 |
| 1195.64746 | 0.006 |
| 1193.719 | 0.005 |
| 1191.79053 | 0.005 |
| 1189.86207 | 0.005 |
| 1187.93361 | 0.006 |
| 1186.00514 | 0.006 |
| 1184.07668 | 0.007 |
| 1182.14822 | 0.008 |
| 1180.21975 | 0.009 |
| 1178.29129 | 0.01 |
| 1176.36283 | 0.011 |
| 1174.43436 | 0.012 |
| 1172.5059 | 0.012 |
| 1170.57743 | 0.011 |
| 1168.64897 | 0.01 |
| 1166.72051 | 0.01 |
| 1164.79204 | 0.009 |
| 1162.86358 | 0.009 |
| 1160.93512 | 0.009 |
| 1159.00665 | 0.01 |
| 1157.07819 | 0.009 |
| 1155.14973 | 0.009 |
| 1153.22126 | 0.008 |
| 1151.2928 | 0.007 |
| 1149.36433 | 0.007 |
| 1147.43587 | 0.007 |
| 1145.50741 | 0.007 |
| 1143.57894 | 0.006 |
| 1141.65048 | 0.006 |
| 1139.72202 | 0.006 |
| 1137.79355 | 0.005 |
| 1135.86509 | 0.004 |
| 1133.93663 | 0.004 |
| 1132.00816 | 0.003 |
| 1130.0797 | 0.003 |
| 1128.15123 | 0.003 |
| 1126.22277 | 0.003 |
| 1124.29431 | 0.002 |
| 1122.36584 | 0.002 |
| 1120.43738 | 0.002 |
| 1118.50892 | 0.002 |
| 1116.58045 | 0.002 |
| 1114.65199 | 0.002 |
| 1112.72353 | 0.001 |
| 1110.79506 | 0.001 |
| 1108.8666 | 0.001 |
| 1106.93813 | 0.001 |
| 1105.00967 | 0.001 |
| 1103.08121 | 0.002 |
| 1101.15274 | 0.002 |
| 1099.22428 | 0.004 |
| 1097.29582 | 0.006 |
| 1095.36735 | 0.009 |
| 1093.43889 | 0.01 |
| 1091.51043 | 0.009 |
| 1089.58196 | 0.008 |
| 1087.6535 | 0.006 |
| 1085.72503 | 0.006 |
| 1083.79657 | 0.005 |
| 1081.86811 | 0.006 |
| 1079.93964 | 0.006 |
| 1078.01118 | 0.007 |
| 1076.08272 | 0.008 |
| 1074.15425 | 0.009 |
| 1072.22579 | 0.01 |
| 1070.29733 | 0.01 |
| 1068.36886 | 0.01 |
| 1066.4404 | 0.01 |
| 1064.51193 | 0.009 |
| 1062.58347 | 0.008 |
| 1060.65501 | 0.008 |
| 1058.72654 | 0.007 |
| 1056.79808 | 0.006 |
| 1054.86962 | 0.006 |
| 1052.94115 | 0.005 |
| 1051.01269 | 0.005 |
| 1049.08422 | 0.005 |
| 1047.15576 | 0.004 |
| 1045.2273 | 0.004 |
| 1043.29883 | 0.005 |
| 1041.37037 | 0.006 |
| 1039.44191 | 0.008 |
| 1037.51344 | 0.01 |
| 1035.58498 | 0.012 |
| 1033.65652 | 0.013 |
| 1031.72805 | 0.014 |
| 1029.79959 | 0.014 |
| 1027.87112 | 0.014 |
| 1025.94266 | 0.013 |
| 1024.0142 | 0.012 |
| 1022.08573 | 0.011 |
| 1020.15727 | 0.011 |
| 1018.22881 | 0.01 |
| 1016.30034 | 0.01 |
| 1014.37188 | 0.01 |
| 1012.44342 | 0.009 |
| 1010.51495 | 0.008 |
| 1008.58649 | 0.008 |
| 1006.65802 | 0.007 |
| 1004.72956 | 0.007 |
| 1002.8011 | 0.007 |
| 1000.87263 | 0.007 |
| 998.94417 | 0.007 |
| 997.01571 | 0.007 |
| 995.08724 | 0.007 |
| 993.15878 | 0.007 |
| 991.23032 | 0.007 |
| 989.30185 | 0.007 |
| 987.37339 | 0.007 |
| 985.44492 | 0.006 |
| 983.51646 | 0.006 |
| 981.588 | 0.006 |
| 979.65953 | 0.005 |
| 977.73107 | 0.005 |
| 975.80261 | 0.005 |
| 973.87414 | 0.005 |
| 971.94568 | 0.005 |
| 970.01722 | 0.006 |
| 968.08875 | 0.007 |
| 966.16029 | 0.009 |
| 964.23182 | 0.009 |
| 962.30336 | 0.009 |
| 960.3749 | 0.008 |
| 958.44643 | 0.007 |
| 956.51797 | 0.006 |
| 954.58951 | 0.005 |
| 952.66104 | 0.005 |
| 950.73258 | 0.005 |
| 948.80412 | 0.005 |
| 946.87565 | 0.005 |
| 944.94719 | 0.004 |
| 943.01872 | 0.004 |
| 941.09026 | 0.004 |
| 939.1618 | 0.004 |
| 937.23333 | 0.004 |
| 935.30487 | 0.004 |
| 933.37641 | 0.003 |
| 931.44794 | 0.003 |
| 929.51948 | 0.003 |
| 927.59102 | 0.003 |
| 925.66255 | 0.003 |
| 923.73409 | 0.003 |
| 921.80562 | 0.003 |
| 919.87716 | 0.003 |
| 917.9487 | 0.003 |
| 916.02023 | 0.003 |
| 914.09177 | 0.002 |
| 912.16331 | 0.002 |
| 910.23484 | 0.002 |
| 908.30638 | 0.002 |
| 906.37791 | 0.002 |
| 904.44945 | 0.002 |
| 902.52099 | 0.002 |
| 900.59252 | 0.002 |
| 898.66406 | 0.002 |
| 896.7356 | 0.002 |
| 894.80713 | 0.002 |
| 892.87867 | 0.002 |
| 890.95021 | 0.002 |
| 889.02174 | 0.002 |
| 887.09328 | 0.002 |
| 885.16481 | 0.002 |
| 883.23635 | 0.002 |
| 881.30789 | 0.002 |
| 879.37942 | 0.002 |
| 877.45096 | 0.003 |
| 875.5225 | 0.004 |
| 873.59403 | 0.005 |
| 871.66557 | 0.005 |
| 869.73711 | 0.004 |
| 867.80864 | 0.004 |
| 865.88018 | 0.003 |
| 863.95171 | 0.003 |
| 862.02325 | 0.002 |
| 860.09479 | 0.002 |
| 858.16632 | 0.002 |
| 856.23786 | 0.002 |
| 854.3094 | 0.002 |
| 852.38093 | 0.002 |
| 850.45247 | 0.002 |
| 848.52401 | 0.002 |
| 846.59554 | 0.002 |
| 844.66708 | 0.002 |
| 842.73861 | 0.001 |
| 840.81015 | 0.001 |
| 838.88169 | 0.001 |
| 836.95322 | 0.001 |
| 835.02476 | 0.001 |
| 833.0963 | 0.001 |
| 831.16783 | 0.002 |
| 829.23937 | 0.003 |
| 827.31091 | 0.005 |
| 825.38244 | 0.006 |
| 823.45398 | 0.005 |
| 821.52551 | 0.004 |
| 819.59705 | 0.003 |
| 817.66859 | 0.002 |
| 815.74012 | 0.002 |
| 813.81166 | 0.002 |
| 811.8832 | 0.002 |
| 809.95473 | 0.002 |
| 808.02627 | 0.002 |
| 806.09781 | 0.002 |
| 804.16934 | 0.002 |
| 802.24088 | 0.002 |
| 800.31241 | 0.001 |
| 798.38395 | 0.001 |
| 796.45549 | 0.001 |
| 794.52702 | 0.001 |
| 792.59856 | 0.001 |
| 790.6701 | 0.001 |
| 788.74163 | 0.001 |
| 786.81317 | 0.001 |
| 784.88471 | 0.001 |
| 782.95624 | 0.001 |
| 781.02778 | 0.001 |
| 779.09931 | 0.001 |
| 777.17085 | 0.001 |
| 775.24239 | 0.001 |
| 773.31392 | 0.001 |
| 771.38546 | 0.001 |
| 769.457 | 0.001 |
| 767.52853 | 0.001 |
| 765.60007 | 0.001 |
| 763.6716 | 0.001 |
| 761.74314 | 0.002 |
| 759.81468 | 0.002 |
| 757.88621 | 0.002 |
| 755.95775 | 0.002 |
| 754.02929 | 0.002 |
| 752.10082 | 0.002 |
| 750.17236 | 0.002 |
| 748.2439 | 0.002 |
| 746.31543 | 0.002 |
| 744.38697 | 0.002 |
| 742.4585 | 0.003 |
| 740.53004 | 0.003 |
| 738.60158 | 0.003 |
| 736.67311 | 0.003 |
| 734.74465 | 0.003 |
| 732.81619 | 0.002 |
| 730.88772 | 0.002 |
| 728.95926 | 0.003 |
| 727.0308 | 0.004 |
| 725.10233 | 0.005 |
| 723.17387 | 0.006 |
| 721.2454 | 0.006 |
| 719.31694 | 0.006 |
| 717.38848 | 0.004 |
| 715.46001 | 0.003 |
| 713.53155 | 0.003 |
| 711.60309 | 0.002 |
| 709.67462 | 0.003 |
| 707.74616 | 0.004 |
| 705.8177 | 0.006 |
| 703.88923 | 0.008 |
| 701.96077 | 0.008 |
| 700.0323 | 0.007 |
| 698.10384 | 0.005 |
| 696.17538 | 0.004 |
| 694.24691 | 0.003 |
| 692.31845 | 0.003 |
| 690.38999 | 0.002 |
| 688.46152 | 0.002 |
| 686.53306 | 0.002 |
| 684.6046 | 0.002 |
| 682.67613 | 0.002 |
| 680.74767 | 0.002 |
| 678.8192 | 0.001 |
| 676.89074 | 0.001 |
| 674.96228 | 0.001 |
| 673.03381 | 0.001 |
| 671.10535 | 0.001 |
| 669.17689 | 0.001 |
| 667.24842 | 0.001 |
| 665.31996 | 0.001 |
| 663.3915 | 0.001 |
| 661.46303 | 0.001 |
| 659.53457 | 0 |
| 657.6061 | 0 |
| 655.67764 | 0 |
| 653.74918 | 0 |
| 651.82071 | 0 |
| 649.89225 | 0 |
| 647.96379 | 0 |
| 646.03532 | 0 |
| 644.10686 | 0 |
| 642.1784 | 0 |
| 640.24993 | 0 |
| 638.32147 | 0.001 |
| 636.393 | 0.001 |
| 634.46454 | 0.002 |
| 632.53608 | 0.004 |
| 630.60761 | 0.004 |
| 628.67915 | 0.005 |
| 626.75069 | 0.005 |
| 624.82222 | 0.006 |
| 622.89376 | 0.007 |
| 620.96529 | 0.006 |
| 619.03683 | 0.004 |
| 617.10837 | 0.003 |
| 615.1799 | 0.003 |
| 613.25144 | 0.005 |
| 611.32298 | 0.007 |
| 609.39451 | 0.008 |
| 607.46605 | 0.009 |
| 605.53759 | 0.009 |
| 603.60912 | 0.008 |
| 601.68066 | 0.007 |
| 599.75219 | 0.007 |
| 597.82373 | 0.006 |
| 595.89527 | 0.005 |
| 593.9668 | 0.005 |
| 592.03834 | 0.004 |
| 590.10988 | 0.004 |
| 588.18141 | 0.003 |
| 586.25295 | 0.003 |
| 584.32449 | 0.003 |
| 582.39602 | 0.003 |
| 580.46756 | 0.003 |
| 578.53909 | 0.004 |
| 576.61063 | 0.005 |
| 574.68217 | 0.006 |
| 572.7537 | 0.007 |
| 570.82524 | 0.007 |
| 568.89678 | 0.006 |
| 566.96831 | 0.006 |
| 565.03985 | 0.006 |
| 563.11139 | 0.007 |
| 561.18292 | 0.007 |
| 559.25446 | 0.007 |
| 557.32599 | 0.007 |
| 555.39753 | 0.007 |
| 553.46907 | 0.006 |
| 551.5406 | 0.005 |
| 549.61214 | 0.005 |
| 547.68368 | 0.004 |
| 545.75521 | 0.005 |
| 543.82675 | 0.005 |
| 541.89829 | 0.006 |
| 539.96982 | 0.005 |
| 538.04136 | 0.005 |
| 536.11289 | 0.004 |
| 534.18443 | 0.003 |
| 532.25597 | 0.003 |
| 530.3275 | 0.003 |
| 528.39904 | 0.002 |
| 526.47058 | 0.002 |
| 524.54211 | 0.002 |
| 522.61365 | 0.002 |
| 520.68519 | 0.001 |
| 518.75672 | 0.001 |
| 516.82826 | 0.001 |
| 514.89979 | 0.001 |
| 512.97133 | 0.001 |
| 511.04287 | 0 |
| 509.1144 | 0 |
| 507.18594 | 0 |
| 505.25748 | 0 |
| 503.32901 | 0 |
| 501.40055 | 0 |
| 499.47209 | 0 |